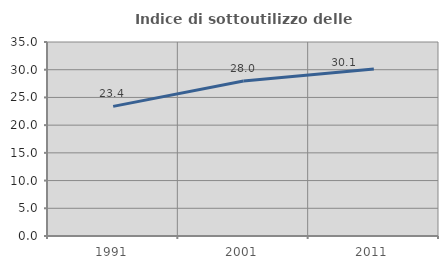
| Category | Indice di sottoutilizzo delle abitazioni  |
|---|---|
| 1991.0 | 23.388 |
| 2001.0 | 27.963 |
| 2011.0 | 30.112 |